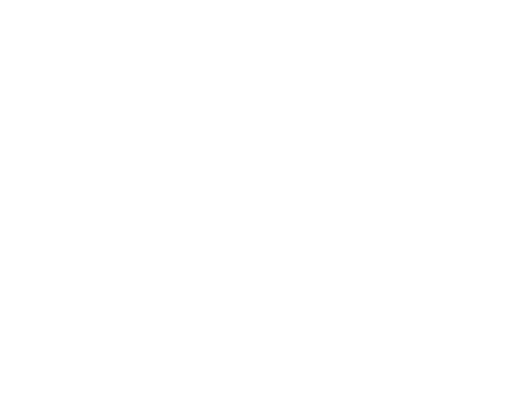
| Category | Series 0 | Series 1 | Series 2 |
|---|---|---|---|
| Impuestos | 18405868.13 | 0.1 |  |
| Cuotas y Aportaciones de Seguridad Social | 0 | 0 |  |
| Contribuciones de Mejoras | 0 | 0 |  |
| Derechos | 10988595 | 0.06 |  |
| Productos | 119025 | 0.001 |  |
| Aprovechamientos | 848700 | 0.005 |  |
| Ingresos por Ventas de Bienes y Servicios | 0 | 0 |  |
| Participaciones y Aportaciones | 117886500 | 0.639 |  |
| Transferencias, Asignaciones, Subsidios y Otras Ayudas | 36225000 | 0.196 |  |
| Ingresos Derivados de Financiamientos | 0 | 0 |  |